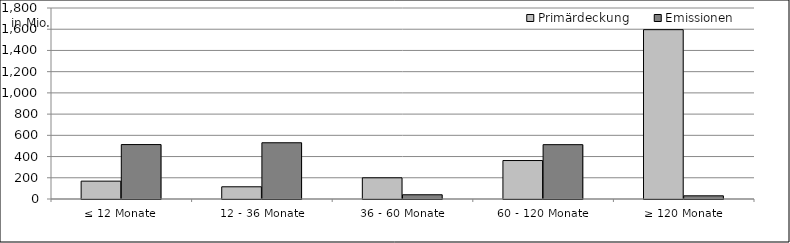
| Category | Primärdeckung | Emissionen |
|---|---|---|
| ≤ 12 Monate | 168282735.86 | 513000000 |
| 12 - 36 Monate | 115059857.51 | 530000000 |
| 36 - 60 Monate | 199747723.724 | 40000000 |
| 60 - 120 Monate | 362443156.09 | 512086000 |
| ≥ 120 Monate | 1595838454.678 | 30000000 |